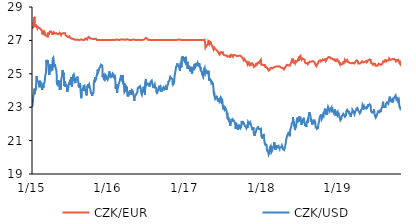
| Category | CZK/EUR | CZK/USD |
|---|---|---|
| 2015-01-02 | 27.7 | 23.001 |
| 2015-01-05 | 27.675 | 23.225 |
| 2015-01-06 | 27.695 | 23.249 |
| 2015-01-07 | 27.785 | 23.505 |
| 2015-01-08 | 27.865 | 23.68 |
| 2015-01-09 | 28.06 | 23.752 |
| 2015-01-12 | 28.29 | 23.965 |
| 2015-01-13 | 28.41 | 24.112 |
| 2015-01-14 | 28.23 | 23.975 |
| 2015-01-15 | 27.84 | 23.783 |
| 2015-01-16 | 27.79 | 23.977 |
| 2015-01-19 | 27.88 | 24.015 |
| 2015-01-20 | 27.845 | 24.049 |
| 2015-01-21 | 27.945 | 24.104 |
| 2015-01-22 | 27.9 | 24.013 |
| 2015-01-23 | 27.835 | 24.859 |
| 2015-01-26 | 27.755 | 24.68 |
| 2015-01-27 | 27.865 | 24.643 |
| 2015-01-28 | 27.84 | 24.543 |
| 2015-01-29 | 27.8 | 24.562 |
| 2015-01-30 | 27.795 | 24.585 |
| 2015-02-02 | 27.75 | 24.537 |
| 2015-02-03 | 27.75 | 24.388 |
| 2015-02-04 | 27.77 | 24.261 |
| 2015-02-05 | 27.73 | 24.304 |
| 2015-02-06 | 27.695 | 24.19 |
| 2015-02-09 | 27.72 | 24.58 |
| 2015-02-10 | 27.725 | 24.541 |
| 2015-02-11 | 27.68 | 24.462 |
| 2015-02-12 | 27.705 | 24.455 |
| 2015-02-13 | 27.64 | 24.285 |
| 2015-02-16 | 27.64 | 24.224 |
| 2015-02-17 | 27.62 | 24.192 |
| 2015-02-18 | 27.58 | 24.254 |
| 2015-02-19 | 27.37 | 24.033 |
| 2015-02-20 | 27.505 | 24.344 |
| 2015-02-23 | 27.445 | 24.291 |
| 2015-02-24 | 27.48 | 24.257 |
| 2015-02-25 | 27.42 | 24.165 |
| 2015-02-26 | 27.51 | 24.306 |
| 2015-02-27 | 27.43 | 24.401 |
| 2015-03-02 | 27.49 | 24.48 |
| 2015-03-03 | 27.45 | 24.576 |
| 2015-03-04 | 27.465 | 24.683 |
| 2015-03-05 | 27.42 | 24.77 |
| 2015-03-06 | 27.3 | 24.899 |
| 2015-03-09 | 27.25 | 25.093 |
| 2015-03-10 | 27.285 | 25.397 |
| 2015-03-11 | 27.29 | 25.8 |
| 2015-03-12 | 27.305 | 25.735 |
| 2015-03-13 | 27.31 | 25.832 |
| 2015-03-16 | 27.305 | 25.856 |
| 2015-03-17 | 27.185 | 25.565 |
| 2015-03-18 | 27.32 | 25.797 |
| 2015-03-19 | 27.425 | 25.687 |
| 2015-03-20 | 27.48 | 25.5 |
| 2015-03-23 | 27.375 | 25.091 |
| 2015-03-24 | 27.39 | 25.017 |
| 2015-03-25 | 27.375 | 24.923 |
| 2015-03-26 | 27.385 | 24.951 |
| 2015-03-27 | 27.525 | 25.345 |
| 2015-03-30 | 27.475 | 25.333 |
| 2015-03-31 | 27.53 | 25.586 |
| 2015-04-01 | 27.545 | 25.563 |
| 2015-04-02 | 27.57 | 25.456 |
| 2015-04-03 | 27.54 | 25.232 |
| 2015-04-07 | 27.46 | 25.315 |
| 2015-04-08 | 27.375 | 25.205 |
| 2015-04-09 | 27.375 | 25.407 |
| 2015-04-10 | 27.38 | 25.901 |
| 2015-04-13 | 27.395 | 25.963 |
| 2015-04-14 | 27.345 | 25.886 |
| 2015-04-15 | 27.415 | 25.911 |
| 2015-04-16 | 27.485 | 25.662 |
| 2015-04-17 | 27.485 | 25.41 |
| 2015-04-20 | 27.42 | 25.569 |
| 2015-04-21 | 27.42 | 25.627 |
| 2015-04-22 | 27.465 | 25.568 |
| 2015-04-23 | 27.4 | 25.434 |
| 2015-04-24 | 27.455 | 25.366 |
| 2015-04-27 | 27.44 | 25.343 |
| 2015-04-28 | 27.47 | 25.14 |
| 2015-04-29 | 27.435 | 24.939 |
| 2015-04-30 | 27.43 | 24.46 |
| 2015-05-04 | 27.365 | 24.535 |
| 2015-05-05 | 27.36 | 24.61 |
| 2015-05-06 | 27.415 | 24.41 |
| 2015-05-07 | 27.405 | 24.255 |
| 2015-05-11 | 27.395 | 24.582 |
| 2015-05-12 | 27.395 | 24.374 |
| 2015-05-13 | 27.455 | 24.465 |
| 2015-05-14 | 27.455 | 24.038 |
| 2015-05-15 | 27.4 | 24.185 |
| 2015-05-18 | 27.4 | 24.059 |
| 2015-05-19 | 27.355 | 24.471 |
| 2015-05-20 | 27.33 | 24.577 |
| 2015-05-21 | 27.35 | 24.57 |
| 2015-05-22 | 27.395 | 24.543 |
| 2015-05-25 | 27.37 | 24.931 |
| 2015-05-26 | 27.395 | 25.072 |
| 2015-05-27 | 27.405 | 25.226 |
| 2015-05-28 | 27.46 | 25.203 |
| 2015-05-29 | 27.41 | 24.978 |
| 2015-06-01 | 27.44 | 25.078 |
| 2015-06-02 | 27.44 | 24.883 |
| 2015-06-03 | 27.46 | 24.704 |
| 2015-06-04 | 27.465 | 24.263 |
| 2015-06-05 | 27.395 | 24.426 |
| 2015-06-08 | 27.43 | 24.56 |
| 2015-06-09 | 27.36 | 24.328 |
| 2015-06-10 | 27.32 | 24.22 |
| 2015-06-11 | 27.315 | 24.331 |
| 2015-06-12 | 27.3 | 24.328 |
| 2015-06-15 | 27.28 | 24.319 |
| 2015-06-16 | 27.255 | 24.309 |
| 2015-06-17 | 27.24 | 24.148 |
| 2015-06-18 | 27.275 | 23.92 |
| 2015-06-19 | 27.21 | 24.08 |
| 2015-06-22 | 27.205 | 23.981 |
| 2015-06-23 | 27.19 | 24.266 |
| 2015-06-24 | 27.205 | 24.26 |
| 2015-06-25 | 27.23 | 24.297 |
| 2015-06-26 | 27.23 | 24.306 |
| 2015-06-29 | 27.245 | 24.473 |
| 2015-06-30 | 27.245 | 24.347 |
| 2015-07-01 | 27.245 | 24.557 |
| 2015-07-02 | 27.265 | 24.633 |
| 2015-07-03 | 27.14 | 24.46 |
| 2015-07-07 | 27.1 | 24.793 |
| 2015-07-08 | 27.115 | 24.592 |
| 2015-07-09 | 27.11 | 24.528 |
| 2015-07-10 | 27.125 | 24.238 |
| 2015-07-13 | 27.1 | 24.522 |
| 2015-07-14 | 27.08 | 24.55 |
| 2015-07-15 | 27.075 | 24.59 |
| 2015-07-16 | 27.11 | 24.946 |
| 2015-07-17 | 27.055 | 24.843 |
| 2015-07-20 | 27.07 | 24.94 |
| 2015-07-21 | 27.07 | 24.908 |
| 2015-07-22 | 27.065 | 24.827 |
| 2015-07-23 | 27.04 | 24.581 |
| 2015-07-24 | 27.045 | 24.72 |
| 2015-07-27 | 27.03 | 24.444 |
| 2015-07-28 | 27.025 | 24.504 |
| 2015-07-29 | 27.065 | 24.539 |
| 2015-07-30 | 27.05 | 24.691 |
| 2015-07-31 | 27.03 | 24.648 |
| 2015-08-03 | 27.04 | 24.687 |
| 2015-08-04 | 27.055 | 24.649 |
| 2015-08-05 | 27.04 | 24.769 |
| 2015-08-06 | 27.03 | 24.833 |
| 2015-08-07 | 27.025 | 24.706 |
| 2015-08-10 | 27.035 | 24.664 |
| 2015-08-11 | 27.03 | 24.448 |
| 2015-08-12 | 27.02 | 24.227 |
| 2015-08-13 | 27.025 | 24.322 |
| 2015-08-14 | 27.02 | 24.189 |
| 2015-08-17 | 27.02 | 24.339 |
| 2015-08-18 | 27.02 | 24.427 |
| 2015-08-19 | 27.022 | 24.475 |
| 2015-08-20 | 27.023 | 24.163 |
| 2015-08-21 | 27.021 | 23.952 |
| 2015-08-24 | 27.065 | 23.538 |
| 2015-08-25 | 27.11 | 23.564 |
| 2015-08-26 | 27.085 | 23.754 |
| 2015-08-27 | 27.1 | 24.022 |
| 2015-08-28 | 27.05 | 23.999 |
| 2015-08-31 | 27.03 | 24.098 |
| 2015-09-01 | 27.02 | 24.04 |
| 2015-09-02 | 27.02 | 23.987 |
| 2015-09-03 | 27.025 | 24.069 |
| 2015-09-04 | 27.03 | 24.265 |
| 2015-09-07 | 27.025 | 24.249 |
| 2015-09-08 | 27.045 | 24.231 |
| 2015-09-09 | 27.06 | 24.292 |
| 2015-09-10 | 27.04 | 24.17 |
| 2015-09-11 | 27.075 | 24.021 |
| 2015-09-14 | 27.115 | 23.984 |
| 2015-09-15 | 27.085 | 23.922 |
| 2015-09-16 | 27.06 | 24.096 |
| 2015-09-17 | 27.11 | 23.967 |
| 2015-09-18 | 27.07 | 23.707 |
| 2015-09-21 | 27.05 | 24.047 |
| 2015-09-22 | 27.06 | 24.258 |
| 2015-09-23 | 27.09 | 24.291 |
| 2015-09-24 | 27.16 | 24.16 |
| 2015-09-25 | 27.19 | 24.387 |
| 2015-09-29 | 27.21 | 24.286 |
| 2015-09-30 | 27.18 | 24.266 |
| 2015-10-01 | 27.17 | 24.356 |
| 2015-10-02 | 27.16 | 24.334 |
| 2015-10-05 | 27.12 | 24.132 |
| 2015-10-06 | 27.11 | 24.154 |
| 2015-10-07 | 27.095 | 24.051 |
| 2015-10-08 | 27.11 | 24.085 |
| 2015-10-09 | 27.11 | 23.856 |
| 2015-10-12 | 27.105 | 23.834 |
| 2015-10-13 | 27.13 | 23.853 |
| 2015-10-14 | 27.11 | 23.762 |
| 2015-10-15 | 27.08 | 23.677 |
| 2015-10-16 | 27.08 | 23.841 |
| 2015-10-19 | 27.085 | 23.898 |
| 2015-10-20 | 27.08 | 23.809 |
| 2015-10-21 | 27.08 | 23.852 |
| 2015-10-22 | 27.07 | 23.925 |
| 2015-10-23 | 27.075 | 24.45 |
| 2015-10-26 | 27.09 | 24.604 |
| 2015-10-27 | 27.1 | 24.504 |
| 2015-10-29 | 27.11 | 24.803 |
| 2015-10-30 | 27.09 | 24.594 |
| 2015-11-02 | 27.1 | 24.559 |
| 2015-11-03 | 27.1 | 24.689 |
| 2015-11-04 | 27.075 | 24.78 |
| 2015-11-05 | 27.045 | 24.853 |
| 2015-11-06 | 27.03 | 24.892 |
| 2015-11-09 | 27.04 | 25.09 |
| 2015-11-10 | 27.045 | 25.249 |
| 2015-11-11 | 27.025 | 25.218 |
| 2015-11-12 | 27.035 | 25.205 |
| 2015-11-13 | 27.03 | 25.107 |
| 2015-11-16 | 27.03 | 25.207 |
| 2015-11-18 | 27.03 | 25.34 |
| 2015-11-19 | 27.025 | 25.282 |
| 2015-11-20 | 27.03 | 25.289 |
| 2015-11-23 | 27.025 | 25.422 |
| 2015-11-24 | 27.03 | 25.376 |
| 2015-11-25 | 27.025 | 25.527 |
| 2015-11-26 | 27.03 | 25.463 |
| 2015-11-27 | 27.025 | 25.54 |
| 2015-11-30 | 27.03 | 25.545 |
| 2015-12-01 | 27.025 | 25.493 |
| 2015-12-02 | 27.025 | 25.492 |
| 2015-12-03 | 27.035 | 25.326 |
| 2015-12-04 | 27.035 | 24.802 |
| 2015-12-07 | 27.02 | 24.997 |
| 2015-12-08 | 27.02 | 24.841 |
| 2015-12-09 | 27.02 | 24.688 |
| 2015-12-10 | 27.02 | 24.69 |
| 2015-12-11 | 27.025 | 24.676 |
| 2015-12-14 | 27.02 | 24.62 |
| 2015-12-15 | 27.02 | 24.57 |
| 2015-12-16 | 27.03 | 24.726 |
| 2015-12-17 | 27.03 | 24.935 |
| 2015-12-18 | 27.03 | 24.947 |
| 2015-12-21 | 27.025 | 24.862 |
| 2015-12-22 | 27.03 | 24.679 |
| 2015-12-23 | 27.03 | 24.762 |
| 2015-12-28 | 27.02 | 24.645 |
| 2015-12-29 | 27.03 | 24.679 |
| 2015-12-30 | 27.025 | 24.728 |
| 2015-12-31 | 27.025 | 24.824 |
| 2016-01-04 | 27.02 | 24.794 |
| 2016-01-05 | 27.02 | 25.145 |
| 2016-01-06 | 27.025 | 25.196 |
| 2016-01-07 | 27.03 | 24.873 |
| 2016-01-08 | 27.02 | 24.873 |
| 2016-01-11 | 27.02 | 24.815 |
| 2016-01-12 | 27.02 | 24.937 |
| 2016-01-13 | 27.02 | 24.983 |
| 2016-01-14 | 27.02 | 24.804 |
| 2016-01-15 | 27.02 | 24.756 |
| 2016-01-18 | 27.035 | 24.821 |
| 2016-01-19 | 27.025 | 24.865 |
| 2016-01-20 | 27.04 | 24.789 |
| 2016-01-21 | 27.065 | 24.844 |
| 2016-01-22 | 27.025 | 25.002 |
| 2016-01-25 | 27.02 | 24.98 |
| 2016-01-26 | 27.02 | 24.928 |
| 2016-01-27 | 27.025 | 24.82 |
| 2016-01-28 | 27.02 | 24.78 |
| 2016-01-29 | 27.025 | 24.76 |
| 2016-02-01 | 27.02 | 24.823 |
| 2016-02-02 | 27.025 | 24.748 |
| 2016-02-03 | 27.02 | 24.72 |
| 2016-02-04 | 27.02 | 24.11 |
| 2016-02-05 | 27.035 | 24.134 |
| 2016-02-08 | 27.06 | 24.379 |
| 2016-02-09 | 27.06 | 24.09 |
| 2016-02-10 | 27.03 | 24.006 |
| 2016-02-11 | 27.07 | 23.857 |
| 2016-02-12 | 27.065 | 24.004 |
| 2016-02-15 | 27.035 | 24.182 |
| 2016-02-16 | 27.03 | 24.214 |
| 2016-02-17 | 27.03 | 24.276 |
| 2016-02-18 | 27.02 | 24.375 |
| 2016-02-19 | 27.025 | 24.351 |
| 2016-02-22 | 27.02 | 24.505 |
| 2016-02-23 | 27.03 | 24.57 |
| 2016-02-24 | 27.045 | 24.629 |
| 2016-02-25 | 27.05 | 24.526 |
| 2016-02-26 | 27.065 | 24.589 |
| 2016-02-29 | 27.055 | 24.848 |
| 2016-03-01 | 27.055 | 24.879 |
| 2016-03-02 | 27.045 | 24.933 |
| 2016-03-03 | 27.055 | 24.819 |
| 2016-03-04 | 27.06 | 24.661 |
| 2016-03-07 | 27.055 | 24.692 |
| 2016-03-08 | 27.06 | 24.541 |
| 2016-03-09 | 27.045 | 24.64 |
| 2016-03-10 | 27.035 | 24.899 |
| 2016-03-11 | 27.06 | 24.398 |
| 2016-03-14 | 27.05 | 24.324 |
| 2016-03-15 | 27.045 | 24.347 |
| 2016-03-16 | 27.05 | 24.45 |
| 2016-03-17 | 27.045 | 23.908 |
| 2016-03-18 | 27.035 | 23.966 |
| 2016-03-21 | 27.03 | 23.98 |
| 2016-03-22 | 27.035 | 24.117 |
| 2016-03-23 | 27.035 | 24.201 |
| 2016-03-24 | 27.065 | 24.267 |
| 2016-03-29 | 27.075 | 24.183 |
| 2016-03-30 | 27.075 | 23.896 |
| 2016-03-31 | 27.055 | 23.757 |
| 2016-04-01 | 27.03 | 23.64 |
| 2016-04-04 | 27.05 | 23.766 |
| 2016-04-05 | 27.035 | 23.774 |
| 2016-04-06 | 27.03 | 23.834 |
| 2016-04-07 | 27.025 | 23.775 |
| 2016-04-08 | 27.02 | 23.771 |
| 2016-04-11 | 27.025 | 23.724 |
| 2016-04-12 | 27.03 | 23.717 |
| 2016-04-13 | 27.035 | 23.923 |
| 2016-04-14 | 27.03 | 24.018 |
| 2016-04-15 | 27.025 | 23.948 |
| 2016-04-18 | 27.02 | 23.889 |
| 2016-04-19 | 27.02 | 23.821 |
| 2016-04-20 | 27.02 | 23.743 |
| 2016-04-21 | 27.025 | 23.798 |
| 2016-04-22 | 27.045 | 24.014 |
| 2016-04-25 | 27.045 | 24.014 |
| 2016-04-26 | 27.025 | 23.946 |
| 2016-04-27 | 27.035 | 23.916 |
| 2016-04-28 | 27.045 | 23.811 |
| 2016-04-29 | 27.04 | 23.714 |
| 2016-05-02 | 27.05 | 23.534 |
| 2016-05-03 | 27.035 | 23.383 |
| 2016-05-04 | 27.03 | 23.457 |
| 2016-05-05 | 27.03 | 23.628 |
| 2016-05-06 | 27.02 | 23.654 |
| 2016-05-09 | 27.02 | 23.717 |
| 2016-05-10 | 27.025 | 23.762 |
| 2016-05-11 | 27.02 | 23.681 |
| 2016-05-12 | 27.025 | 23.729 |
| 2016-05-13 | 27.02 | 23.81 |
| 2016-05-16 | 27.02 | 23.859 |
| 2016-05-17 | 27.02 | 23.873 |
| 2016-05-18 | 27.02 | 23.955 |
| 2016-05-19 | 27.02 | 24.133 |
| 2016-05-20 | 27.025 | 24.083 |
| 2016-05-23 | 27.035 | 24.106 |
| 2016-05-24 | 27.025 | 24.192 |
| 2016-05-25 | 27.03 | 24.253 |
| 2016-05-26 | 27.025 | 24.192 |
| 2016-05-27 | 27.03 | 24.203 |
| 2016-05-30 | 27.02 | 24.255 |
| 2016-05-31 | 27.02 | 24.223 |
| 2016-06-01 | 27.025 | 24.186 |
| 2016-06-02 | 27.03 | 24.167 |
| 2016-06-03 | 27.025 | 24.221 |
| 2016-06-06 | 27.025 | 23.805 |
| 2016-06-07 | 27.02 | 23.815 |
| 2016-06-08 | 27.02 | 23.743 |
| 2016-06-09 | 27.02 | 23.815 |
| 2016-06-10 | 27.025 | 23.905 |
| 2016-06-13 | 27.035 | 23.997 |
| 2016-06-14 | 27.045 | 24.088 |
| 2016-06-15 | 27.075 | 24.103 |
| 2016-06-16 | 27.065 | 24.224 |
| 2016-06-17 | 27.07 | 24.052 |
| 2016-06-20 | 27.06 | 23.877 |
| 2016-06-21 | 27.065 | 23.923 |
| 2016-06-22 | 27.07 | 23.976 |
| 2016-06-23 | 27.06 | 23.761 |
| 2016-06-24 | 27.1 | 24.491 |
| 2016-06-27 | 27.15 | 24.692 |
| 2016-06-28 | 27.11 | 24.484 |
| 2016-06-29 | 27.115 | 24.443 |
| 2016-06-30 | 27.13 | 24.433 |
| 2016-07-01 | 27.095 | 24.335 |
| 2016-07-04 | 27.095 | 24.322 |
| 2016-07-07 | 27.05 | 24.417 |
| 2016-07-08 | 27.03 | 24.421 |
| 2016-07-11 | 27.035 | 24.458 |
| 2016-07-12 | 27.035 | 24.367 |
| 2016-07-13 | 27.035 | 24.415 |
| 2016-07-14 | 27.04 | 24.235 |
| 2016-07-15 | 27.03 | 24.284 |
| 2016-07-18 | 27.025 | 24.446 |
| 2016-07-19 | 27.025 | 24.488 |
| 2016-07-20 | 27.02 | 24.532 |
| 2016-07-21 | 27.025 | 24.53 |
| 2016-07-22 | 27.025 | 24.535 |
| 2016-07-25 | 27.02 | 24.601 |
| 2016-07-26 | 27.025 | 24.573 |
| 2016-07-27 | 27.035 | 24.594 |
| 2016-07-28 | 27.045 | 24.382 |
| 2016-07-29 | 27.03 | 24.324 |
| 2016-08-01 | 27.03 | 24.212 |
| 2016-08-02 | 27.03 | 24.147 |
| 2016-08-03 | 27.035 | 24.143 |
| 2016-08-04 | 27.03 | 24.273 |
| 2016-08-05 | 27.02 | 24.219 |
| 2016-08-08 | 27.03 | 24.38 |
| 2016-08-09 | 27.025 | 24.392 |
| 2016-08-10 | 27.025 | 24.17 |
| 2016-08-11 | 27.02 | 24.224 |
| 2016-08-12 | 27.02 | 24.211 |
| 2016-08-15 | 27.02 | 24.162 |
| 2016-08-16 | 27.02 | 23.918 |
| 2016-08-17 | 27.025 | 23.973 |
| 2016-08-18 | 27.025 | 23.865 |
| 2016-08-19 | 27.02 | 23.851 |
| 2016-08-22 | 27.025 | 23.901 |
| 2016-08-23 | 27.025 | 23.832 |
| 2016-08-24 | 27.025 | 23.984 |
| 2016-08-25 | 27.03 | 23.938 |
| 2016-08-26 | 27.02 | 23.928 |
| 2016-08-29 | 27.02 | 24.192 |
| 2016-08-30 | 27.025 | 24.196 |
| 2016-08-31 | 27.03 | 24.286 |
| 2016-09-01 | 27.025 | 24.252 |
| 2016-09-02 | 27.02 | 24.138 |
| 2016-09-05 | 27.02 | 24.218 |
| 2016-09-06 | 27.02 | 24.211 |
| 2016-09-07 | 27.02 | 24.041 |
| 2016-09-08 | 27.02 | 23.921 |
| 2016-09-09 | 27.02 | 23.975 |
| 2016-09-12 | 27.025 | 24.074 |
| 2016-09-13 | 27.02 | 24.031 |
| 2016-09-14 | 27.025 | 24.083 |
| 2016-09-15 | 27.025 | 24.017 |
| 2016-09-16 | 27.025 | 24.073 |
| 2016-09-19 | 27.02 | 24.197 |
| 2016-09-20 | 27.02 | 24.16 |
| 2016-09-21 | 27.02 | 24.232 |
| 2016-09-22 | 27.02 | 24.046 |
| 2016-09-23 | 27.02 | 24.096 |
| 2016-09-26 | 27.02 | 23.992 |
| 2016-09-27 | 27.025 | 24.088 |
| 2016-09-29 | 27.02 | 24.076 |
| 2016-09-30 | 27.02 | 24.21 |
| 2016-10-03 | 27.02 | 24.049 |
| 2016-10-04 | 27.02 | 24.207 |
| 2016-10-05 | 27.02 | 24.085 |
| 2016-10-06 | 27.02 | 24.156 |
| 2016-10-07 | 27.02 | 24.249 |
| 2016-10-10 | 27.02 | 24.209 |
| 2016-10-11 | 27.02 | 24.387 |
| 2016-10-12 | 27.025 | 24.521 |
| 2016-10-13 | 27.02 | 24.478 |
| 2016-10-14 | 27.025 | 24.561 |
| 2016-10-17 | 27.025 | 24.584 |
| 2016-10-18 | 27.02 | 24.578 |
| 2016-10-19 | 27.02 | 24.611 |
| 2016-10-20 | 27.02 | 24.603 |
| 2016-10-21 | 27.02 | 24.82 |
| 2016-10-24 | 27.02 | 24.809 |
| 2016-10-25 | 27.02 | 24.846 |
| 2016-10-26 | 27.02 | 24.736 |
| 2016-10-27 | 27.02 | 24.729 |
| 2016-10-31 | 27.025 | 24.687 |
| 2016-11-01 | 27.025 | 24.508 |
| 2016-11-02 | 27.02 | 24.356 |
| 2016-11-03 | 27.02 | 24.426 |
| 2016-11-04 | 27.02 | 24.359 |
| 2016-11-07 | 27.02 | 24.424 |
| 2016-11-08 | 27.02 | 24.478 |
| 2016-11-09 | 27.025 | 24.521 |
| 2016-11-10 | 27.02 | 24.804 |
| 2016-11-11 | 27.055 | 24.802 |
| 2016-11-14 | 27.025 | 25.08 |
| 2016-11-15 | 27.03 | 25.106 |
| 2016-11-16 | 27.035 | 25.257 |
| 2016-11-18 | 27.035 | 25.436 |
| 2016-11-21 | 27.03 | 25.424 |
| 2016-11-22 | 27.045 | 25.474 |
| 2016-11-23 | 27.025 | 25.488 |
| 2016-11-24 | 27.035 | 25.629 |
| 2016-11-25 | 27.04 | 25.532 |
| 2016-11-28 | 27.045 | 25.538 |
| 2016-11-29 | 27.05 | 25.574 |
| 2016-11-30 | 27.06 | 25.455 |
| 2016-12-01 | 27.06 | 25.465 |
| 2016-12-02 | 27.06 | 25.426 |
| 2016-12-05 | 27.055 | 25.276 |
| 2016-12-06 | 27.045 | 25.191 |
| 2016-12-07 | 27.035 | 25.195 |
| 2016-12-08 | 27.04 | 25.134 |
| 2016-12-09 | 27.025 | 25.588 |
| 2016-12-12 | 27.025 | 25.511 |
| 2016-12-13 | 27.02 | 25.461 |
| 2016-12-14 | 27.025 | 25.386 |
| 2016-12-15 | 27.02 | 25.932 |
| 2016-12-16 | 27.02 | 25.882 |
| 2016-12-19 | 27.02 | 25.926 |
| 2016-12-20 | 27.02 | 26.068 |
| 2016-12-21 | 27.02 | 25.927 |
| 2016-12-22 | 27.02 | 25.869 |
| 2016-12-23 | 27.02 | 25.865 |
| 2016-12-27 | 27.02 | 25.866 |
| 2016-12-28 | 27.04 | 26 |
| 2016-12-29 | 27.02 | 25.849 |
| 2016-12-30 | 27.02 | 25.639 |
| 2017-01-02 | 27.02 | 25.819 |
| 2017-01-03 | 27.02 | 26.017 |
| 2017-01-04 | 27.02 | 25.889 |
| 2017-01-05 | 27.02 | 25.714 |
| 2017-01-06 | 27.02 | 25.516 |
| 2017-01-09 | 27.02 | 25.697 |
| 2017-01-10 | 27.02 | 25.571 |
| 2017-01-11 | 27.02 | 25.721 |
| 2017-01-12 | 27.02 | 25.3 |
| 2017-01-13 | 27.02 | 25.347 |
| 2017-01-16 | 27.02 | 25.503 |
| 2017-01-17 | 27.02 | 25.291 |
| 2017-01-18 | 27.02 | 25.335 |
| 2017-01-19 | 27.02 | 25.329 |
| 2017-01-20 | 27.02 | 25.414 |
| 2017-01-23 | 27.025 | 25.22 |
| 2017-01-24 | 27.02 | 25.141 |
| 2017-01-25 | 27.02 | 25.144 |
| 2017-01-26 | 27.02 | 25.252 |
| 2017-01-27 | 27.02 | 25.297 |
| 2017-01-30 | 27.02 | 25.421 |
| 2017-01-31 | 27.02 | 25.12 |
| 2017-02-01 | 27.02 | 25.074 |
| 2017-02-02 | 27.02 | 24.992 |
| 2017-02-03 | 27.02 | 25.155 |
| 2017-02-06 | 27.02 | 25.219 |
| 2017-02-07 | 27.02 | 25.306 |
| 2017-02-08 | 27.02 | 25.333 |
| 2017-02-09 | 27.02 | 25.268 |
| 2017-02-10 | 27.02 | 25.422 |
| 2017-02-13 | 27.02 | 25.421 |
| 2017-02-14 | 27.02 | 25.437 |
| 2017-02-15 | 27.02 | 25.596 |
| 2017-02-16 | 27.02 | 25.36 |
| 2017-02-17 | 27.02 | 25.372 |
| 2017-02-20 | 27.02 | 25.449 |
| 2017-02-21 | 27.02 | 25.644 |
| 2017-02-22 | 27.02 | 25.7 |
| 2017-02-23 | 27.02 | 25.556 |
| 2017-02-24 | 27.02 | 25.468 |
| 2017-02-27 | 27.02 | 25.522 |
| 2017-02-28 | 27.02 | 25.497 |
| 2017-03-01 | 27.02 | 25.654 |
| 2017-03-02 | 27.02 | 25.695 |
| 2017-03-03 | 27.02 | 25.574 |
| 2017-03-06 | 27.02 | 25.506 |
| 2017-03-07 | 27.02 | 25.547 |
| 2017-03-08 | 27.02 | 25.631 |
| 2017-03-09 | 27.02 | 25.613 |
| 2017-03-10 | 27.02 | 25.482 |
| 2017-03-13 | 27.02 | 25.339 |
| 2017-03-14 | 27.02 | 25.415 |
| 2017-03-15 | 27.02 | 25.434 |
| 2017-03-16 | 27.02 | 25.195 |
| 2017-03-17 | 27.02 | 25.154 |
| 2017-03-20 | 27.02 | 25.129 |
| 2017-03-21 | 27.02 | 25.009 |
| 2017-03-22 | 27.02 | 25.003 |
| 2017-03-23 | 27.02 | 25.05 |
| 2017-03-24 | 27.02 | 25.008 |
| 2017-03-27 | 27.02 | 24.813 |
| 2017-03-28 | 27.02 | 24.883 |
| 2017-03-29 | 27.02 | 25.14 |
| 2017-03-30 | 27.02 | 25.159 |
| 2017-03-31 | 27.03 | 25.282 |
| 2017-04-03 | 27.045 | 25.367 |
| 2017-04-04 | 27.055 | 25.404 |
| 2017-04-05 | 27.06 | 25.37 |
| 2017-04-06 | 26.75 | 25.076 |
| 2017-04-07 | 26.565 | 24.999 |
| 2017-04-10 | 26.53 | 25.082 |
| 2017-04-11 | 26.66 | 25.112 |
| 2017-04-12 | 26.695 | 25.172 |
| 2017-04-13 | 26.705 | 25.122 |
| 2017-04-18 | 26.76 | 25.053 |
| 2017-04-19 | 26.795 | 24.985 |
| 2017-04-20 | 26.91 | 25.043 |
| 2017-04-21 | 26.935 | 25.179 |
| 2017-04-24 | 26.795 | 24.706 |
| 2017-04-25 | 26.77 | 24.58 |
| 2017-04-26 | 26.945 | 24.735 |
| 2017-04-27 | 26.935 | 24.752 |
| 2017-04-28 | 26.92 | 24.629 |
| 2017-05-02 | 26.89 | 24.639 |
| 2017-05-03 | 26.87 | 24.607 |
| 2017-05-04 | 26.77 | 24.499 |
| 2017-05-05 | 26.78 | 24.433 |
| 2017-05-09 | 26.67 | 24.497 |
| 2017-05-10 | 26.64 | 24.486 |
| 2017-05-11 | 26.6 | 24.495 |
| 2017-05-12 | 26.575 | 24.435 |
| 2017-05-15 | 26.47 | 24.124 |
| 2017-05-16 | 26.42 | 23.888 |
| 2017-05-17 | 26.435 | 23.778 |
| 2017-05-18 | 26.63 | 23.927 |
| 2017-05-19 | 26.5 | 23.71 |
| 2017-05-22 | 26.485 | 23.557 |
| 2017-05-23 | 26.48 | 23.615 |
| 2017-05-24 | 26.465 | 23.642 |
| 2017-05-25 | 26.41 | 23.552 |
| 2017-05-26 | 26.435 | 23.606 |
| 2017-05-29 | 26.435 | 23.627 |
| 2017-05-30 | 26.465 | 23.69 |
| 2017-05-31 | 26.42 | 23.545 |
| 2017-06-01 | 26.395 | 23.554 |
| 2017-06-02 | 26.36 | 23.501 |
| 2017-06-05 | 26.325 | 23.401 |
| 2017-06-06 | 26.335 | 23.393 |
| 2017-06-07 | 26.315 | 23.459 |
| 2017-06-08 | 26.27 | 23.392 |
| 2017-06-09 | 26.22 | 23.463 |
| 2017-06-12 | 26.2 | 23.348 |
| 2017-06-13 | 26.145 | 23.308 |
| 2017-06-14 | 26.165 | 23.354 |
| 2017-06-15 | 26.21 | 23.468 |
| 2017-06-16 | 26.23 | 23.49 |
| 2017-06-19 | 26.17 | 23.369 |
| 2017-06-20 | 26.295 | 23.568 |
| 2017-06-21 | 26.265 | 23.565 |
| 2017-06-22 | 26.27 | 23.522 |
| 2017-06-23 | 26.295 | 23.53 |
| 2017-06-26 | 26.24 | 23.457 |
| 2017-06-27 | 26.27 | 23.29 |
| 2017-06-28 | 26.325 | 23.141 |
| 2017-06-29 | 26.285 | 23.032 |
| 2017-06-30 | 26.195 | 22.952 |
| 2017-07-03 | 26.14 | 22.993 |
| 2017-07-04 | 26.13 | 23.017 |
| 2017-07-07 | 26.08 | 22.852 |
| 2017-07-10 | 26.095 | 22.917 |
| 2017-07-11 | 26.125 | 22.907 |
| 2017-07-12 | 26.11 | 22.804 |
| 2017-07-13 | 26.12 | 22.878 |
| 2017-07-14 | 26.075 | 22.842 |
| 2017-07-17 | 26.09 | 22.762 |
| 2017-07-18 | 26.08 | 22.57 |
| 2017-07-19 | 26.035 | 22.572 |
| 2017-07-20 | 26.04 | 22.671 |
| 2017-07-21 | 26.02 | 22.347 |
| 2017-07-24 | 26.025 | 22.344 |
| 2017-07-25 | 26.02 | 22.25 |
| 2017-07-26 | 26.045 | 22.371 |
| 2017-07-27 | 26.045 | 22.269 |
| 2017-07-28 | 26.05 | 22.209 |
| 2017-07-31 | 26.08 | 22.24 |
| 2017-08-01 | 26.13 | 22.123 |
| 2017-08-02 | 26.125 | 22.099 |
| 2017-08-03 | 25.965 | 21.89 |
| 2017-08-04 | 26.065 | 21.961 |
| 2017-08-07 | 26.115 | 22.135 |
| 2017-08-08 | 26.15 | 22.134 |
| 2017-08-09 | 26.16 | 22.301 |
| 2017-08-10 | 26.16 | 22.297 |
| 2017-08-11 | 26.155 | 22.232 |
| 2017-08-14 | 26.12 | 22.143 |
| 2017-08-15 | 26.14 | 22.26 |
| 2017-08-16 | 26.045 | 22.243 |
| 2017-08-17 | 26.01 | 22.24 |
| 2017-08-18 | 26.11 | 22.243 |
| 2017-08-21 | 26.085 | 22.177 |
| 2017-08-22 | 26.085 | 22.16 |
| 2017-08-23 | 26.125 | 22.14 |
| 2017-08-24 | 26.1 | 22.106 |
| 2017-08-25 | 26.085 | 22.098 |
| 2017-08-28 | 26.1 | 21.887 |
| 2017-08-29 | 26.14 | 21.697 |
| 2017-08-30 | 26.045 | 21.849 |
| 2017-08-31 | 26.105 | 22.073 |
| 2017-09-01 | 26.075 | 21.871 |
| 2017-09-04 | 26.06 | 21.895 |
| 2017-09-05 | 26.075 | 21.928 |
| 2017-09-06 | 26.11 | 21.88 |
| 2017-09-07 | 26.11 | 21.801 |
| 2017-09-08 | 26.1 | 21.641 |
| 2017-09-11 | 26.075 | 21.736 |
| 2017-09-12 | 26.105 | 21.87 |
| 2017-09-13 | 26.1 | 21.787 |
| 2017-09-14 | 26.1 | 21.953 |
| 2017-09-15 | 26.08 | 21.794 |
| 2017-09-18 | 26.09 | 21.836 |
| 2017-09-19 | 26.105 | 21.809 |
| 2017-09-20 | 26.09 | 21.734 |
| 2017-09-21 | 26.085 | 21.891 |
| 2017-09-22 | 26.045 | 21.771 |
| 2017-09-25 | 26.035 | 21.937 |
| 2017-09-26 | 26.055 | 22.103 |
| 2017-09-27 | 26.035 | 22.176 |
| 2017-09-29 | 25.975 | 22.003 |
| 2017-10-02 | 25.995 | 22.135 |
| 2017-10-03 | 25.93 | 22.065 |
| 2017-10-04 | 25.885 | 21.97 |
| 2017-10-05 | 25.835 | 22.003 |
| 2017-10-06 | 25.815 | 22.05 |
| 2017-10-09 | 25.89 | 22.044 |
| 2017-10-10 | 25.9 | 21.96 |
| 2017-10-11 | 25.88 | 21.878 |
| 2017-10-12 | 25.89 | 21.837 |
| 2017-10-13 | 25.81 | 21.852 |
| 2017-10-16 | 25.765 | 21.828 |
| 2017-10-17 | 25.735 | 21.885 |
| 2017-10-18 | 25.705 | 21.881 |
| 2017-10-19 | 25.725 | 21.736 |
| 2017-10-20 | 25.69 | 21.739 |
| 2017-10-23 | 25.64 | 21.84 |
| 2017-10-24 | 25.58 | 21.753 |
| 2017-10-25 | 25.59 | 21.715 |
| 2017-10-26 | 25.585 | 21.779 |
| 2017-10-27 | 25.67 | 22.117 |
| 2017-10-30 | 25.645 | 22.086 |
| 2017-10-31 | 25.67 | 22.06 |
| 2017-11-01 | 25.555 | 22.008 |
| 2017-11-02 | 25.56 | 21.949 |
| 2017-11-03 | 25.65 | 22.006 |
| 2017-11-06 | 25.61 | 22.098 |
| 2017-11-07 | 25.59 | 22.132 |
| 2017-11-08 | 25.56 | 22.053 |
| 2017-11-09 | 25.53 | 21.954 |
| 2017-11-10 | 25.545 | 21.923 |
| 2017-11-13 | 25.565 | 21.929 |
| 2017-11-14 | 25.565 | 21.766 |
| 2017-11-15 | 25.67 | 21.684 |
| 2017-11-16 | 25.56 | 21.712 |
| 2017-11-20 | 25.565 | 21.701 |
| 2017-11-21 | 25.53 | 21.791 |
| 2017-11-22 | 25.47 | 21.677 |
| 2017-11-23 | 25.46 | 21.487 |
| 2017-11-24 | 25.41 | 21.392 |
| 2017-11-27 | 25.43 | 21.279 |
| 2017-11-28 | 25.46 | 21.418 |
| 2017-11-29 | 25.475 | 21.542 |
| 2017-11-30 | 25.495 | 21.519 |
| 2017-12-01 | 25.525 | 21.475 |
| 2017-12-04 | 25.56 | 21.541 |
| 2017-12-05 | 25.655 | 21.656 |
| 2017-12-06 | 25.635 | 21.695 |
| 2017-12-07 | 25.61 | 21.727 |
| 2017-12-08 | 25.555 | 21.765 |
| 2017-12-11 | 25.6 | 21.705 |
| 2017-12-12 | 25.625 | 21.776 |
| 2017-12-13 | 25.65 | 21.86 |
| 2017-12-14 | 25.685 | 21.682 |
| 2017-12-15 | 25.68 | 21.75 |
| 2017-12-18 | 25.685 | 21.775 |
| 2017-12-19 | 25.66 | 21.702 |
| 2017-12-20 | 25.675 | 21.677 |
| 2017-12-21 | 25.715 | 21.684 |
| 2017-12-22 | 25.75 | 21.725 |
| 2017-12-27 | 25.84 | 21.723 |
| 2017-12-28 | 25.645 | 21.489 |
| 2017-12-29 | 25.54 | 21.291 |
| 2018-01-02 | 25.495 | 21.13 |
| 2018-01-03 | 25.545 | 21.238 |
| 2018-01-04 | 25.51 | 21.16 |
| 2018-01-05 | 25.595 | 21.248 |
| 2018-01-08 | 25.525 | 21.324 |
| 2018-01-09 | 25.535 | 21.399 |
| 2018-01-10 | 25.565 | 21.315 |
| 2018-01-11 | 25.545 | 21.256 |
| 2018-01-12 | 25.52 | 21.025 |
| 2018-01-15 | 25.53 | 20.796 |
| 2018-01-16 | 25.515 | 20.863 |
| 2018-01-17 | 25.445 | 20.852 |
| 2018-01-18 | 25.37 | 20.742 |
| 2018-01-19 | 25.43 | 20.749 |
| 2018-01-22 | 25.4 | 20.752 |
| 2018-01-23 | 25.405 | 20.742 |
| 2018-01-24 | 25.375 | 20.543 |
| 2018-01-25 | 25.38 | 20.454 |
| 2018-01-26 | 25.355 | 20.392 |
| 2018-01-29 | 25.295 | 20.432 |
| 2018-01-30 | 25.33 | 20.394 |
| 2018-01-31 | 25.27 | 20.291 |
| 2018-02-01 | 25.265 | 20.281 |
| 2018-02-02 | 25.19 | 20.163 |
| 2018-02-05 | 25.2 | 20.256 |
| 2018-02-06 | 25.23 | 20.464 |
| 2018-02-07 | 25.23 | 20.448 |
| 2018-02-08 | 25.245 | 20.595 |
| 2018-02-09 | 25.335 | 20.645 |
| 2018-02-12 | 25.355 | 20.677 |
| 2018-02-13 | 25.385 | 20.583 |
| 2018-02-14 | 25.36 | 20.539 |
| 2018-02-15 | 25.37 | 20.307 |
| 2018-02-16 | 25.34 | 20.327 |
| 2018-02-19 | 25.325 | 20.406 |
| 2018-02-20 | 25.315 | 20.515 |
| 2018-02-21 | 25.36 | 20.604 |
| 2018-02-22 | 25.315 | 20.623 |
| 2018-02-23 | 25.335 | 20.603 |
| 2018-02-26 | 25.39 | 20.608 |
| 2018-02-27 | 25.405 | 20.652 |
| 2018-02-28 | 25.42 | 20.816 |
| 2018-03-01 | 25.435 | 20.898 |
| 2018-03-02 | 25.41 | 20.638 |
| 2018-03-05 | 25.405 | 20.642 |
| 2018-03-06 | 25.38 | 20.45 |
| 2018-03-07 | 25.415 | 20.47 |
| 2018-03-08 | 25.43 | 20.472 |
| 2018-03-09 | 25.455 | 20.717 |
| 2018-03-12 | 25.45 | 20.688 |
| 2018-03-13 | 25.47 | 20.577 |
| 2018-03-14 | 25.445 | 20.573 |
| 2018-03-15 | 25.415 | 20.594 |
| 2018-03-16 | 25.415 | 20.666 |
| 2018-03-19 | 25.43 | 20.661 |
| 2018-03-20 | 25.42 | 20.707 |
| 2018-03-21 | 25.42 | 20.689 |
| 2018-03-22 | 25.4 | 20.624 |
| 2018-03-23 | 25.405 | 20.586 |
| 2018-03-26 | 25.445 | 20.506 |
| 2018-03-27 | 25.475 | 20.586 |
| 2018-03-28 | 25.46 | 20.533 |
| 2018-03-29 | 25.43 | 20.641 |
| 2018-04-03 | 25.365 | 20.608 |
| 2018-04-04 | 25.34 | 20.645 |
| 2018-04-05 | 25.325 | 20.655 |
| 2018-04-06 | 25.34 | 20.714 |
| 2018-04-09 | 25.355 | 20.608 |
| 2018-04-10 | 25.335 | 20.497 |
| 2018-04-11 | 25.325 | 20.449 |
| 2018-04-12 | 25.315 | 20.548 |
| 2018-04-13 | 25.305 | 20.545 |
| 2018-04-16 | 25.26 | 20.435 |
| 2018-04-17 | 25.255 | 20.439 |
| 2018-04-18 | 25.3 | 20.424 |
| 2018-04-19 | 25.325 | 20.454 |
| 2018-04-20 | 25.34 | 20.584 |
| 2018-04-23 | 25.41 | 20.763 |
| 2018-04-24 | 25.435 | 20.827 |
| 2018-04-25 | 25.465 | 20.899 |
| 2018-04-26 | 25.475 | 20.944 |
| 2018-04-27 | 25.47 | 21.102 |
| 2018-04-30 | 25.54 | 21.144 |
| 2018-05-02 | 25.595 | 21.319 |
| 2018-05-03 | 25.58 | 21.332 |
| 2018-05-04 | 25.505 | 21.31 |
| 2018-05-07 | 25.515 | 21.438 |
| 2018-05-09 | 25.565 | 21.525 |
| 2018-05-10 | 25.495 | 21.465 |
| 2018-05-11 | 25.505 | 21.37 |
| 2018-05-14 | 25.49 | 21.264 |
| 2018-05-15 | 25.55 | 21.501 |
| 2018-05-16 | 25.545 | 21.679 |
| 2018-05-17 | 25.56 | 21.646 |
| 2018-05-18 | 25.59 | 21.718 |
| 2018-05-21 | 25.68 | 21.84 |
| 2018-05-22 | 25.7 | 21.791 |
| 2018-05-23 | 25.815 | 22.041 |
| 2018-05-24 | 25.81 | 22.011 |
| 2018-05-25 | 25.765 | 22.07 |
| 2018-05-28 | 25.73 | 22.095 |
| 2018-05-29 | 25.905 | 22.413 |
| 2018-05-30 | 25.835 | 22.202 |
| 2018-05-31 | 25.79 | 22.05 |
| 2018-06-01 | 25.83 | 22.137 |
| 2018-06-04 | 25.7 | 21.897 |
| 2018-06-05 | 25.65 | 21.971 |
| 2018-06-06 | 25.645 | 21.798 |
| 2018-06-07 | 25.64 | 21.662 |
| 2018-06-08 | 25.795 | 21.944 |
| 2018-06-11 | 25.68 | 21.781 |
| 2018-06-12 | 25.65 | 21.757 |
| 2018-06-13 | 25.71 | 21.856 |
| 2018-06-14 | 25.65 | 21.866 |
| 2018-06-15 | 25.71 | 22.171 |
| 2018-06-18 | 25.74 | 22.165 |
| 2018-06-19 | 25.81 | 22.373 |
| 2018-06-20 | 25.835 | 22.316 |
| 2018-06-21 | 25.865 | 22.413 |
| 2018-06-22 | 25.79 | 22.139 |
| 2018-06-25 | 25.935 | 22.172 |
| 2018-06-26 | 25.9 | 22.188 |
| 2018-06-27 | 25.77 | 22.184 |
| 2018-06-28 | 26 | 22.448 |
| 2018-06-29 | 26.02 | 22.318 |
| 2018-07-02 | 26 | 22.343 |
| 2018-07-03 | 26.075 | 22.356 |
| 2018-07-04 | 26.03 | 22.357 |
| 2018-07-09 | 25.86 | 21.934 |
| 2018-07-10 | 25.9 | 22.113 |
| 2018-07-11 | 25.93 | 22.099 |
| 2018-07-12 | 25.94 | 22.25 |
| 2018-07-13 | 25.92 | 22.262 |
| 2018-07-16 | 25.88 | 22.082 |
| 2018-07-17 | 25.875 | 22.1 |
| 2018-07-18 | 25.855 | 22.268 |
| 2018-07-19 | 25.92 | 22.368 |
| 2018-07-20 | 25.875 | 22.175 |
| 2018-07-23 | 25.85 | 22.065 |
| 2018-07-24 | 25.76 | 22.006 |
| 2018-07-25 | 25.675 | 21.965 |
| 2018-07-26 | 25.645 | 21.891 |
| 2018-07-27 | 25.62 | 22.039 |
| 2018-07-30 | 25.625 | 21.931 |
| 2018-07-31 | 25.6 | 21.814 |
| 2018-08-01 | 25.59 | 21.889 |
| 2018-08-02 | 25.6 | 22.04 |
| 2018-08-03 | 25.66 | 22.144 |
| 2018-08-06 | 25.65 | 22.221 |
| 2018-08-07 | 25.605 | 22.072 |
| 2018-08-08 | 25.58 | 22.076 |
| 2018-08-09 | 25.57 | 22.057 |
| 2018-08-10 | 25.635 | 22.377 |
| 2018-08-13 | 25.66 | 22.503 |
| 2018-08-14 | 25.69 | 22.524 |
| 2018-08-15 | 25.71 | 22.709 |
| 2018-08-16 | 25.7 | 22.606 |
| 2018-08-17 | 25.73 | 22.583 |
| 2018-08-20 | 25.705 | 22.509 |
| 2018-08-21 | 25.74 | 22.376 |
| 2018-08-22 | 25.725 | 22.149 |
| 2018-08-23 | 25.71 | 22.207 |
| 2018-08-24 | 25.745 | 22.218 |
| 2018-08-27 | 25.745 | 22.127 |
| 2018-08-28 | 25.72 | 21.963 |
| 2018-08-29 | 25.745 | 22.08 |
| 2018-08-30 | 25.75 | 22.025 |
| 2018-08-31 | 25.735 | 22.089 |
| 2018-09-03 | 25.75 | 22.183 |
| 2018-09-04 | 25.73 | 22.256 |
| 2018-09-05 | 25.745 | 22.238 |
| 2018-09-06 | 25.715 | 22.09 |
| 2018-09-07 | 25.695 | 22.124 |
| 2018-09-10 | 25.65 | 22.166 |
| 2018-09-11 | 25.65 | 22.157 |
| 2018-09-12 | 25.59 | 22.096 |
| 2018-09-13 | 25.52 | 21.965 |
| 2018-09-14 | 25.475 | 21.79 |
| 2018-09-17 | 25.455 | 21.811 |
| 2018-09-18 | 25.45 | 21.761 |
| 2018-09-19 | 25.43 | 21.796 |
| 2018-09-20 | 25.56 | 21.71 |
| 2018-09-21 | 25.585 | 21.756 |
| 2018-09-24 | 25.615 | 21.763 |
| 2018-09-25 | 25.615 | 21.752 |
| 2018-09-26 | 25.605 | 21.819 |
| 2018-09-27 | 25.715 | 21.967 |
| 2018-10-01 | 25.765 | 22.201 |
| 2018-10-02 | 25.79 | 22.343 |
| 2018-10-03 | 25.78 | 22.329 |
| 2018-10-04 | 25.78 | 22.415 |
| 2018-10-05 | 25.74 | 22.372 |
| 2018-10-08 | 25.735 | 22.426 |
| 2018-10-09 | 25.805 | 22.564 |
| 2018-10-10 | 25.805 | 22.44 |
| 2018-10-11 | 25.85 | 22.335 |
| 2018-10-12 | 25.775 | 22.269 |
| 2018-10-15 | 25.8 | 22.277 |
| 2018-10-16 | 25.815 | 22.283 |
| 2018-10-17 | 25.845 | 22.418 |
| 2018-10-18 | 25.86 | 22.476 |
| 2018-10-19 | 25.865 | 22.552 |
| 2018-10-22 | 25.84 | 22.483 |
| 2018-10-23 | 25.815 | 22.49 |
| 2018-10-24 | 25.83 | 22.685 |
| 2018-10-25 | 25.83 | 22.627 |
| 2018-10-26 | 25.86 | 22.797 |
| 2018-10-29 | 25.85 | 22.715 |
| 2018-10-30 | 25.87 | 22.75 |
| 2018-10-31 | 25.92 | 22.902 |
| 2018-11-01 | 25.875 | 22.712 |
| 2018-11-02 | 25.78 | 22.581 |
| 2018-11-05 | 25.845 | 22.73 |
| 2018-11-06 | 25.835 | 22.606 |
| 2018-11-07 | 25.88 | 22.531 |
| 2018-11-08 | 25.885 | 22.653 |
| 2018-11-09 | 25.935 | 22.857 |
| 2018-11-12 | 25.94 | 23.029 |
| 2018-11-13 | 25.94 | 23.032 |
| 2018-11-14 | 25.995 | 23.013 |
| 2018-11-15 | 25.985 | 22.992 |
| 2018-11-16 | 25.985 | 22.903 |
| 2018-11-19 | 26.01 | 22.761 |
| 2018-11-20 | 26.03 | 22.794 |
| 2018-11-21 | 26 | 22.788 |
| 2018-11-22 | 25.99 | 22.79 |
| 2018-11-23 | 25.955 | 22.866 |
| 2018-11-26 | 25.92 | 22.808 |
| 2018-11-27 | 25.915 | 22.874 |
| 2018-11-28 | 25.93 | 22.977 |
| 2018-11-29 | 25.965 | 22.802 |
| 2018-11-30 | 25.955 | 22.848 |
| 2018-12-03 | 25.92 | 22.874 |
| 2018-12-04 | 25.9 | 22.702 |
| 2018-12-05 | 25.885 | 22.802 |
| 2018-12-06 | 25.89 | 22.796 |
| 2018-12-07 | 25.85 | 22.736 |
| 2018-12-10 | 25.865 | 22.64 |
| 2018-12-11 | 25.845 | 22.711 |
| 2018-12-12 | 25.865 | 22.796 |
| 2018-12-13 | 25.83 | 22.716 |
| 2018-12-14 | 25.795 | 22.858 |
| 2018-12-17 | 25.8 | 22.749 |
| 2018-12-18 | 25.755 | 22.638 |
| 2018-12-19 | 25.76 | 22.591 |
| 2018-12-20 | 25.76 | 22.497 |
| 2018-12-21 | 25.855 | 22.654 |
| 2018-12-27 | 25.86 | 22.733 |
| 2018-12-28 | 25.78 | 22.506 |
| 2018-12-31 | 25.725 | 22.466 |
| 2019-01-02 | 25.75 | 22.594 |
| 2019-01-03 | 25.68 | 22.634 |
| 2019-01-04 | 25.65 | 22.494 |
| 2019-01-07 | 25.575 | 22.347 |
| 2019-01-08 | 25.64 | 22.416 |
| 2019-01-09 | 25.63 | 22.376 |
| 2019-01-10 | 25.625 | 22.221 |
| 2019-01-11 | 25.605 | 22.199 |
| 2019-01-14 | 25.56 | 22.29 |
| 2019-01-15 | 25.57 | 22.382 |
| 2019-01-16 | 25.565 | 22.446 |
| 2019-01-17 | 25.535 | 22.407 |
| 2019-01-18 | 25.58 | 22.432 |
| 2019-01-21 | 25.595 | 22.528 |
| 2019-01-22 | 25.61 | 22.559 |
| 2019-01-23 | 25.695 | 22.605 |
| 2019-01-24 | 25.695 | 22.659 |
| 2019-01-25 | 25.695 | 22.644 |
| 2019-01-28 | 25.725 | 22.529 |
| 2019-01-29 | 25.745 | 22.541 |
| 2019-01-30 | 25.8 | 22.579 |
| 2019-01-31 | 25.76 | 22.427 |
| 2019-02-01 | 25.695 | 22.398 |
| 2019-02-04 | 25.73 | 22.48 |
| 2019-02-05 | 25.7 | 22.508 |
| 2019-02-06 | 25.785 | 22.629 |
| 2019-02-07 | 25.805 | 22.747 |
| 2019-02-08 | 25.805 | 22.745 |
| 2019-02-11 | 25.835 | 22.845 |
| 2019-02-12 | 25.87 | 22.901 |
| 2019-02-13 | 25.795 | 22.819 |
| 2019-02-14 | 25.79 | 22.885 |
| 2019-02-15 | 25.7 | 22.823 |
| 2019-02-18 | 25.715 | 22.703 |
| 2019-02-19 | 25.715 | 22.771 |
| 2019-02-20 | 25.68 | 22.646 |
| 2019-02-21 | 25.645 | 22.586 |
| 2019-02-22 | 25.665 | 22.662 |
| 2019-02-25 | 25.65 | 22.589 |
| 2019-02-26 | 25.665 | 22.594 |
| 2019-02-27 | 25.655 | 22.532 |
| 2019-02-28 | 25.6 | 22.425 |
| 2019-03-01 | 25.635 | 22.52 |
| 2019-03-04 | 25.625 | 22.6 |
| 2019-03-05 | 25.62 | 22.614 |
| 2019-03-06 | 25.595 | 22.641 |
| 2019-03-07 | 25.61 | 22.72 |
| 2019-03-08 | 25.64 | 22.848 |
| 2019-03-11 | 25.655 | 22.818 |
| 2019-03-12 | 25.67 | 22.768 |
| 2019-03-13 | 25.67 | 22.711 |
| 2019-03-14 | 25.67 | 22.724 |
| 2019-03-15 | 25.67 | 22.694 |
| 2019-03-18 | 25.615 | 22.571 |
| 2019-03-19 | 25.6 | 22.537 |
| 2019-03-20 | 25.645 | 22.587 |
| 2019-03-21 | 25.65 | 22.528 |
| 2019-03-22 | 25.725 | 22.761 |
| 2019-03-25 | 25.76 | 22.752 |
| 2019-03-26 | 25.77 | 22.823 |
| 2019-03-27 | 25.8 | 22.912 |
| 2019-03-28 | 25.78 | 22.934 |
| 2019-03-29 | 25.8 | 22.968 |
| 2019-04-01 | 25.79 | 22.955 |
| 2019-04-02 | 25.75 | 22.99 |
| 2019-04-03 | 25.725 | 22.876 |
| 2019-04-04 | 25.695 | 22.91 |
| 2019-04-05 | 25.61 | 22.8 |
| 2019-04-08 | 25.635 | 22.794 |
| 2019-04-09 | 25.62 | 22.716 |
| 2019-04-10 | 25.61 | 22.711 |
| 2019-04-11 | 25.605 | 22.732 |
| 2019-04-12 | 25.62 | 22.633 |
| 2019-04-15 | 25.625 | 22.653 |
| 2019-04-16 | 25.665 | 22.701 |
| 2019-04-17 | 25.655 | 22.702 |
| 2019-04-18 | 25.68 | 22.826 |
| 2019-04-23 | 25.745 | 22.896 |
| 2019-04-24 | 25.73 | 22.95 |
| 2019-04-25 | 25.735 | 23.137 |
| 2019-04-26 | 25.705 | 23.091 |
| 2019-04-29 | 25.68 | 23.028 |
| 2019-04-30 | 25.66 | 22.864 |
| 2019-05-02 | 25.645 | 22.875 |
| 2019-05-03 | 25.715 | 23.055 |
| 2019-05-06 | 25.715 | 22.962 |
| 2019-05-07 | 25.73 | 23.005 |
| 2019-05-09 | 25.72 | 22.983 |
| 2019-05-10 | 25.73 | 22.915 |
| 2019-05-13 | 25.775 | 22.918 |
| 2019-05-14 | 25.75 | 22.942 |
| 2019-05-15 | 25.76 | 23.035 |
| 2019-05-16 | 25.695 | 22.933 |
| 2019-05-17 | 25.75 | 23.048 |
| 2019-05-20 | 25.765 | 23.073 |
| 2019-05-21 | 25.775 | 23.096 |
| 2019-05-22 | 25.79 | 23.089 |
| 2019-05-23 | 25.82 | 23.181 |
| 2019-05-24 | 25.83 | 23.091 |
| 2019-05-27 | 25.835 | 23.074 |
| 2019-05-28 | 25.845 | 23.092 |
| 2019-05-29 | 25.86 | 23.179 |
| 2019-05-30 | 25.84 | 23.208 |
| 2019-05-31 | 25.817 | 23.153 |
| 2019-06-03 | 25.83 | 23.093 |
| 2019-06-04 | 25.745 | 22.906 |
| 2019-06-05 | 25.65 | 22.77 |
| 2019-06-06 | 25.66 | 22.775 |
| 2019-06-07 | 25.64 | 22.745 |
| 2019-06-10 | 25.625 | 22.675 |
| 2019-06-11 | 25.64 | 22.651 |
| 2019-06-12 | 25.615 | 22.623 |
| 2019-06-13 | 25.58 | 22.659 |
| 2019-06-14 | 25.54 | 22.674 |
| 2019-06-17 | 25.56 | 22.752 |
| 2019-06-18 | 25.61 | 22.797 |
| 2019-06-19 | 25.635 | 22.874 |
| 2019-06-20 | 25.62 | 22.663 |
| 2019-06-21 | 25.61 | 22.632 |
| 2019-06-24 | 25.6 | 22.465 |
| 2019-06-25 | 25.555 | 22.438 |
| 2019-06-26 | 25.485 | 22.434 |
| 2019-06-27 | 25.435 | 22.372 |
| 2019-06-28 | 25.445 | 22.363 |
| 2019-07-01 | 25.48 | 22.453 |
| 2019-07-02 | 25.46 | 22.527 |
| 2019-07-03 | 25.455 | 22.535 |
| 2019-07-04 | 25.435 | 22.534 |
| 2019-07-08 | 25.51 | 22.745 |
| 2019-07-09 | 25.545 | 22.8 |
| 2019-07-10 | 25.565 | 22.785 |
| 2019-07-11 | 25.605 | 22.689 |
| 2019-07-12 | 25.59 | 22.742 |
| 2019-07-15 | 25.575 | 22.694 |
| 2019-07-16 | 25.575 | 22.796 |
| 2019-07-17 | 25.605 | 22.829 |
| 2019-07-18 | 25.585 | 22.811 |
| 2019-07-19 | 25.545 | 22.756 |
| 2019-07-22 | 25.535 | 22.771 |
| 2019-07-23 | 25.545 | 22.866 |
| 2019-07-24 | 25.54 | 22.927 |
| 2019-07-25 | 25.52 | 22.961 |
| 2019-07-26 | 25.54 | 22.932 |
| 2019-07-29 | 25.61 | 23.033 |
| 2019-07-30 | 25.65 | 22.996 |
| 2019-07-31 | 25.66 | 23.014 |
| 2019-08-01 | 25.74 | 23.326 |
| 2019-08-02 | 25.765 | 23.199 |
| 2019-08-05 | 25.775 | 23.052 |
| 2019-08-06 | 25.725 | 22.999 |
| 2019-08-07 | 25.72 | 22.96 |
| 2019-08-08 | 25.79 | 23.041 |
| 2019-08-09 | 25.83 | 23.068 |
| 2019-08-12 | 25.83 | 23.074 |
| 2019-08-13 | 25.83 | 23.019 |
| 2019-08-14 | 25.885 | 23.135 |
| 2019-08-15 | 25.88 | 23.211 |
| 2019-08-16 | 25.735 | 23.236 |
| 2019-08-19 | 25.78 | 23.219 |
| 2019-08-20 | 25.795 | 23.289 |
| 2019-08-21 | 25.795 | 23.231 |
| 2019-08-22 | 25.785 | 23.261 |
| 2019-08-23 | 25.765 | 23.274 |
| 2019-08-26 | 25.79 | 23.199 |
| 2019-08-27 | 25.815 | 23.252 |
| 2019-08-28 | 25.845 | 23.322 |
| 2019-08-29 | 25.85 | 23.344 |
| 2019-08-30 | 25.915 | 23.484 |
| 2019-09-02 | 25.92 | 23.632 |
| 2019-09-03 | 25.885 | 23.665 |
| 2019-09-04 | 25.835 | 23.444 |
| 2019-09-05 | 25.85 | 23.379 |
| 2019-09-06 | 25.835 | 23.424 |
| 2019-09-09 | 25.855 | 23.431 |
| 2019-09-10 | 25.865 | 23.431 |
| 2019-09-11 | 25.865 | 23.507 |
| 2019-09-12 | 25.83 | 23.565 |
| 2019-09-13 | 25.845 | 23.286 |
| 2019-09-16 | 25.88 | 23.461 |
| 2019-09-17 | 25.915 | 23.499 |
| 2019-09-18 | 25.89 | 23.424 |
| 2019-09-19 | 25.895 | 23.398 |
| 2019-09-20 | 25.91 | 23.49 |
| 2019-09-23 | 25.89 | 23.567 |
| 2019-09-24 | 25.87 | 23.514 |
| 2019-09-25 | 25.86 | 23.55 |
| 2019-09-26 | 25.85 | 23.636 |
| 2019-09-27 | 25.84 | 23.633 |
| 2019-09-30 | 25.815 | 23.707 |
| 2019-10-01 | 25.74 | 23.618 |
| 2019-10-02 | 25.74 | 23.561 |
| 2019-10-03 | 25.74 | 23.506 |
| 2019-10-04 | 25.74 | 23.444 |
| 2019-10-07 | 25.78 | 23.451 |
| 2019-10-08 | 25.805 | 23.488 |
| 2019-10-09 | 25.825 | 23.518 |
| 2019-10-10 | 25.89 | 23.476 |
| 2019-10-11 | 25.81 | 23.372 |
| 2019-10-14 | 25.825 | 23.411 |
| 2019-10-15 | 25.82 | 23.458 |
| 2019-10-16 | 25.76 | 23.365 |
| 2019-10-17 | 25.67 | 23.107 |
| 2019-10-18 | 25.66 | 23.026 |
| 2019-10-21 | 25.63 | 22.94 |
| 2019-10-22 | 25.575 | 22.974 |
| 2019-10-23 | 25.635 | 23.051 |
| 2019-10-24 | 25.595 | 23.003 |
| 2019-10-25 | 25.57 | 23.022 |